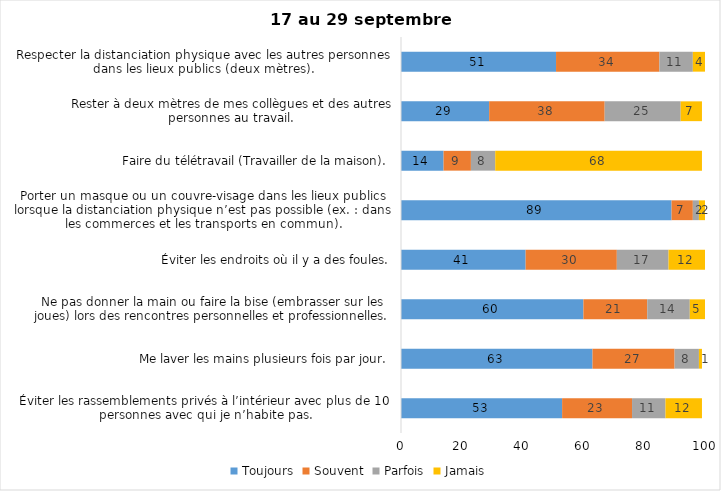
| Category | Toujours | Souvent | Parfois | Jamais |
|---|---|---|---|---|
| Éviter les rassemblements privés à l’intérieur avec plus de 10 personnes avec qui je n’habite pas. | 53 | 23 | 11 | 12 |
| Me laver les mains plusieurs fois par jour. | 63 | 27 | 8 | 1 |
| Ne pas donner la main ou faire la bise (embrasser sur les joues) lors des rencontres personnelles et professionnelles. | 60 | 21 | 14 | 5 |
| Éviter les endroits où il y a des foules. | 41 | 30 | 17 | 12 |
| Porter un masque ou un couvre-visage dans les lieux publics lorsque la distanciation physique n’est pas possible (ex. : dans les commerces et les transports en commun). | 89 | 7 | 2 | 2 |
| Faire du télétravail (Travailler de la maison). | 14 | 9 | 8 | 68 |
| Rester à deux mètres de mes collègues et des autres personnes au travail. | 29 | 38 | 25 | 7 |
| Respecter la distanciation physique avec les autres personnes dans les lieux publics (deux mètres). | 51 | 34 | 11 | 4 |